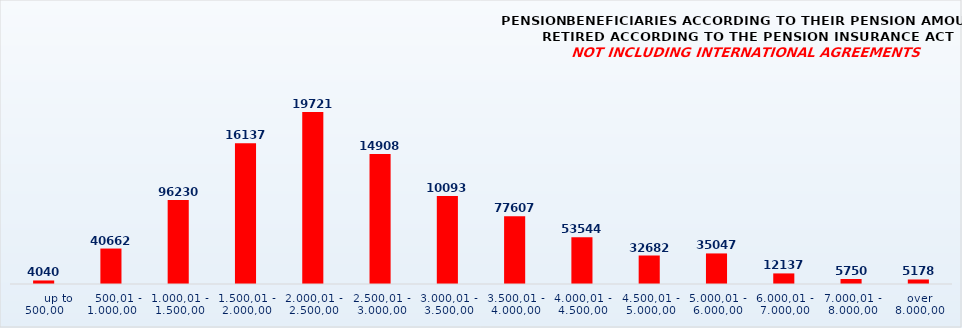
| Category | PENSION BENEFICIARIES ACCORDING TO TYPES AND AMOUNTS OF PENSION, RETIRED ACCORDING TO THE PENSION INSURANCE ACT
NOT INCLUDING INTERNATIONAL AGREEMENTS |
|---|---|
|       up to 500,00 | 4040 |
|    500,01 - 1.000,00 | 40662 |
| 1.000,01 - 1.500,00 | 96230 |
| 1.500,01 - 2.000,00 | 161377 |
| 2.000,01 - 2.500,00 | 197215 |
| 2.500,01 - 3.000,00 | 149086 |
| 3.000,01 - 3.500,00 | 100935 |
| 3.500,01 - 4.000,00 | 77607 |
| 4.000,01 - 4.500,00 | 53544 |
| 4.500,01 - 5.000,00 | 32682 |
| 5.000,01 - 6.000,00 | 35047 |
| 6.000,01 - 7.000,00 | 12137 |
| 7.000,01 - 8.000,00 | 5750 |
|  over  8.000,00 | 5178 |